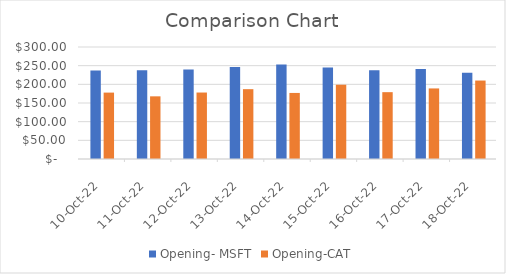
| Category | Opening- MSFT | Opening-CAT |
|---|---|---|
| 2022-10-10 | 237 | 177.85 |
| 2022-10-11 | 237.56 | 167.86 |
| 2022-10-12 | 239.6 | 178.05 |
| 2022-10-13 | 246.4 | 187.05 |
| 2022-10-14 | 253 | 176.94 |
| 2022-10-15 | 245 | 198.96 |
| 2022-10-16 | 237.58 | 179.02 |
| 2022-10-17 | 241.35 | 189.02 |
| 2022-10-18 | 231.04 | 210.15 |